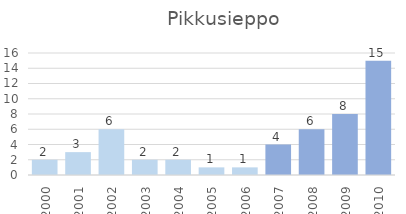
| Category | Series 0 |
|---|---|
| 2000.0 | 2 |
| 2001.0 | 3 |
| 2002.0 | 6 |
| 2003.0 | 2 |
| 2004.0 | 2 |
| 2005.0 | 1 |
| 2006.0 | 1 |
| 2007.0 | 4 |
| 2008.0 | 6 |
| 2009.0 | 8 |
| 2010.0 | 15 |